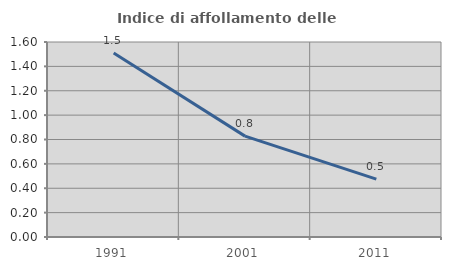
| Category | Indice di affollamento delle abitazioni  |
|---|---|
| 1991.0 | 1.511 |
| 2001.0 | 0.828 |
| 2011.0 | 0.475 |